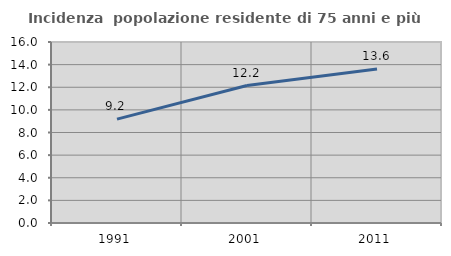
| Category | Incidenza  popolazione residente di 75 anni e più |
|---|---|
| 1991.0 | 9.182 |
| 2001.0 | 12.151 |
| 2011.0 | 13.607 |